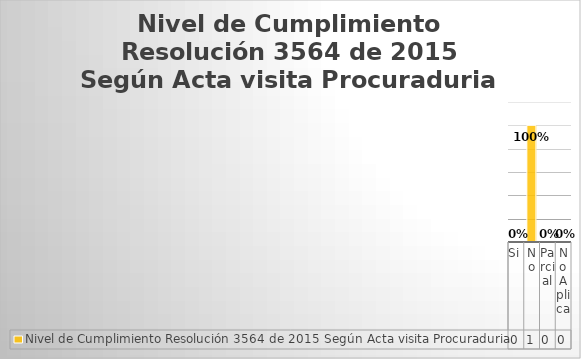
| Category | Nivel de Cumplimiento Resolución 3564 de 2015 Según Acta visita Procuraduria |
|---|---|
| Si | 0 |
| No | 1 |
| Parcial | 0 |
| No Aplica | 0 |